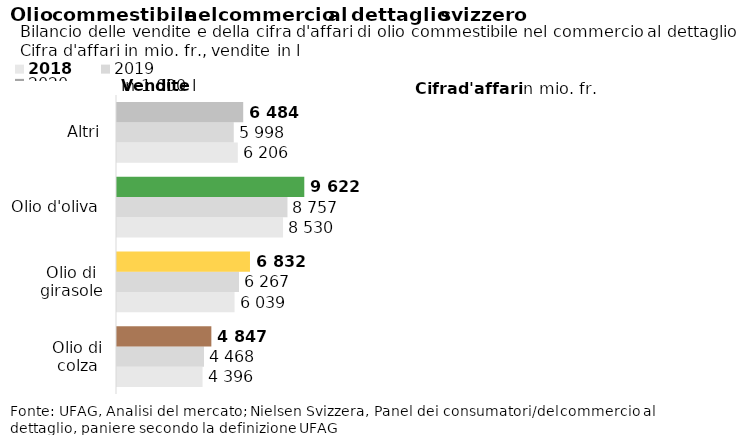
| Category | 2018 | 2019 | 2020 |
|---|---|---|---|
| Olio di colza | 4395.699 | 4468.408 | 4847.152 |
| Olio di girasole | 6038.943 | 6267.299 | 6831.901 |
| Olio d'oliva | 8530.138 | 8756.635 | 9621.549 |
| Altri | 6206.09 | 5998.258 | 6483.97 |